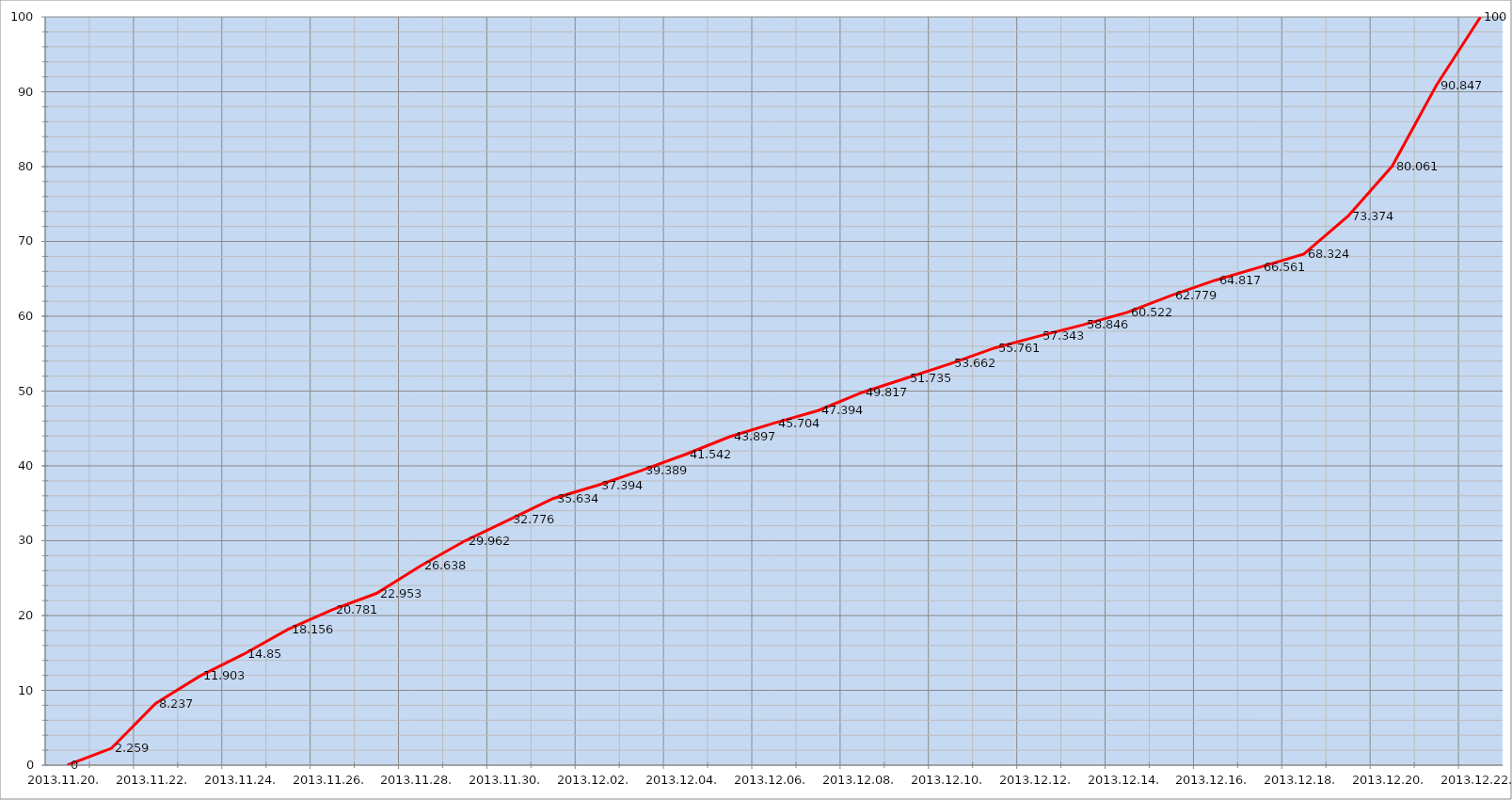
| Category | Szerver 8 |
|---|---|
| 2013-11-20 | 0 |
| 2013-11-21 | 2.259 |
| 2013-11-22 | 8.237 |
| 2013-11-23 | 11.903 |
| 2013-11-24 | 14.85 |
| 2013-11-25 | 18.156 |
| 2013-11-26 | 20.781 |
| 2013-11-27 | 22.953 |
| 2013-11-28 | 26.638 |
| 2013-11-29 | 29.962 |
| 2013-11-30 | 32.776 |
| 2013-12-01 | 35.634 |
| 2013-12-02 | 37.394 |
| 2013-12-03 | 39.389 |
| 2013-12-04 | 41.542 |
| 2013-12-05 | 43.897 |
| 2013-12-06 | 45.704 |
| 2013-12-07 | 47.394 |
| 2013-12-08 | 49.817 |
| 2013-12-09 | 51.735 |
| 2013-12-10 | 53.662 |
| 2013-12-11 | 55.761 |
| 2013-12-12 | 57.343 |
| 2013-12-13 | 58.846 |
| 2013-12-14 | 60.522 |
| 2013-12-15 | 62.779 |
| 2013-12-16 | 64.817 |
| 2013-12-17 | 66.561 |
| 2013-12-18 | 68.324 |
| 2013-12-19 | 73.374 |
| 2013-12-20 | 80.061 |
| 2013-12-21 | 90.847 |
| 2013-12-22 | 100 |